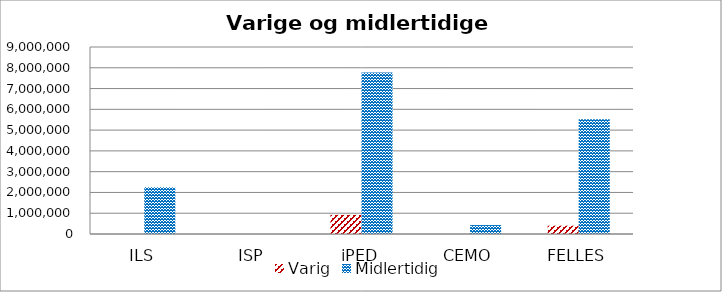
| Category | Varig | Midlertidig |
|---|---|---|
| ILS | 0 | 2250000 |
| ISP | 0 | 0 |
| iPED | 919882 | 7769669 |
| CEMO | 0 | 430000 |
| FELLES | 400000 | 5525000 |